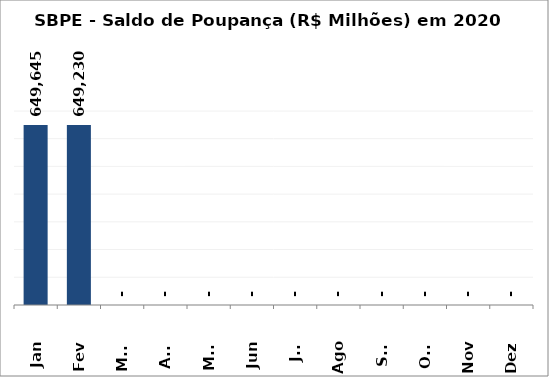
| Category | SBPE - Saldo de Poupança (R$ Milhões) em 2020 |
|---|---|
| Jan | 649645.04 |
| Fev | 649229.63 |
| Mar | 0 |
| Abr | 0 |
| Mai | 0 |
| Jun | 0 |
| Jul | 0 |
| Ago | 0 |
| Set | 0 |
| Out | 0 |
| Nov | 0 |
| Dez | 0 |